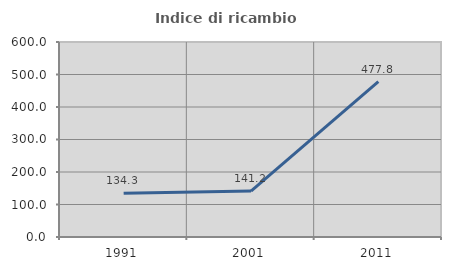
| Category | Indice di ricambio occupazionale  |
|---|---|
| 1991.0 | 134.286 |
| 2001.0 | 141.176 |
| 2011.0 | 477.778 |